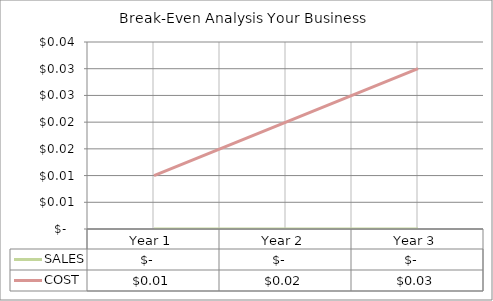
| Category | SALES | COST |
|---|---|---|
| Year 1 | 0 | 0.01 |
| Year 2 | 0 | 0.02 |
| Year 3 | 0 | 0.03 |